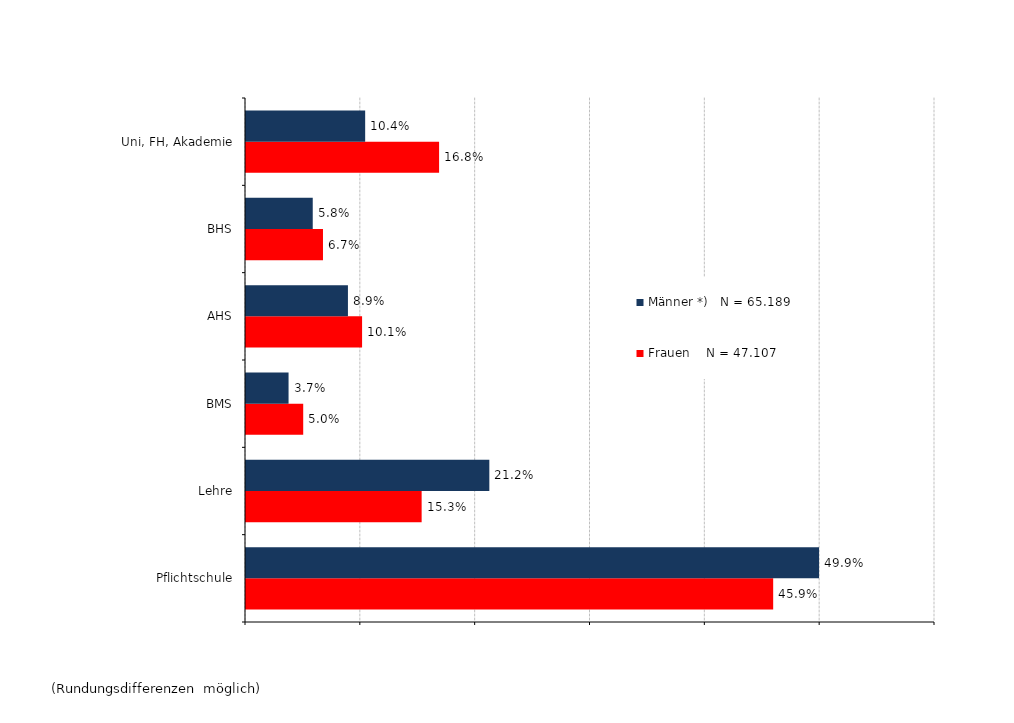
| Category | Frauen    N = 47.107 | Männer *)   N = 65.189 |
|---|---|---|
| Pflichtschule | 0.459 | 0.499 |
| Lehre | 0.153 | 0.212 |
| BMS | 0.05 | 0.037 |
| AHS | 0.101 | 0.089 |
| BHS | 0.067 | 0.058 |
| Uni, FH, Akademie | 0.168 | 0.104 |